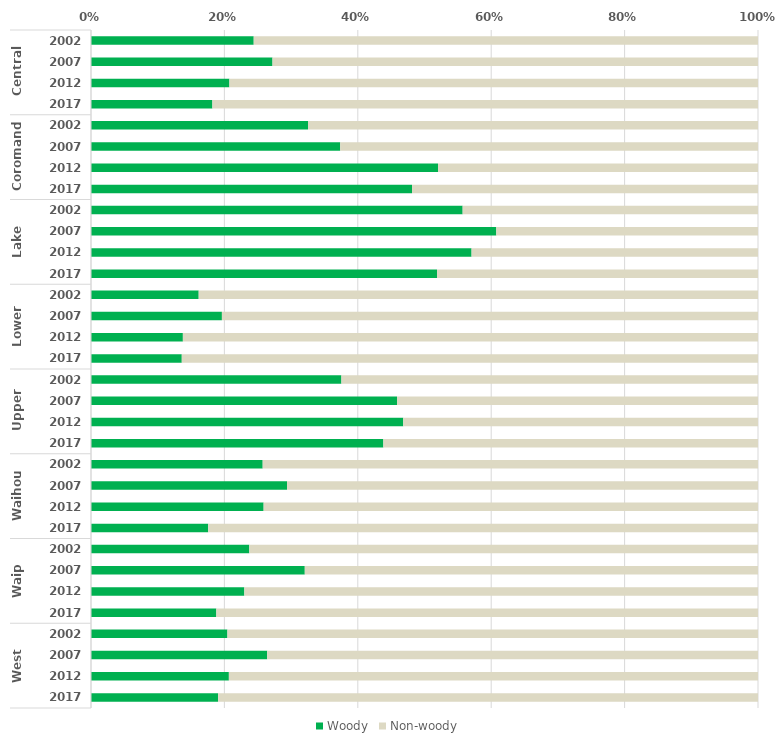
| Category | Woody | Non-woody |
|---|---|---|
| 0 | 24.396 | 75.604 |
| 1 | 27.211 | 72.789 |
| 2 | 20.752 | 79.248 |
| 3 | 18.199 | 81.801 |
| 4 | 32.536 | 67.464 |
| 5 | 37.364 | 62.636 |
| 6 | 52.029 | 47.971 |
| 7 | 48.132 | 51.868 |
| 8 | 55.72 | 44.28 |
| 9 | 60.765 | 39.235 |
| 10 | 57.056 | 42.944 |
| 11 | 51.882 | 48.118 |
| 12 | 16.147 | 83.853 |
| 13 | 19.626 | 80.374 |
| 14 | 13.773 | 86.227 |
| 15 | 13.609 | 86.391 |
| 16 | 37.542 | 62.458 |
| 17 | 45.885 | 54.115 |
| 18 | 46.813 | 53.187 |
| 19 | 43.832 | 56.168 |
| 20 | 25.741 | 74.259 |
| 21 | 29.394 | 70.606 |
| 22 | 25.881 | 74.119 |
| 23 | 17.571 | 82.429 |
| 24 | 23.733 | 76.267 |
| 25 | 32.05 | 67.95 |
| 26 | 22.988 | 77.012 |
| 27 | 18.791 | 81.209 |
| 28 | 20.455 | 79.545 |
| 29 | 26.418 | 73.582 |
| 30 | 20.67 | 79.33 |
| 31 | 19.055 | 80.945 |